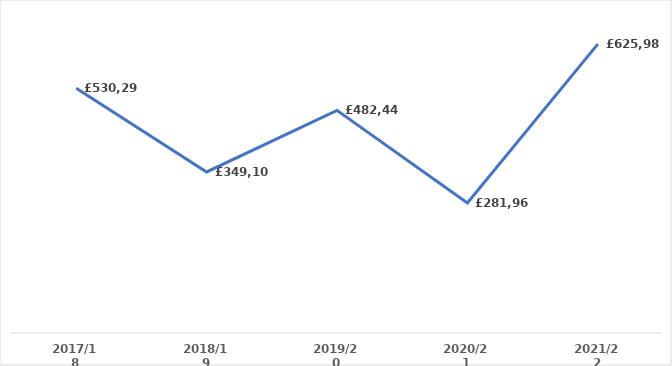
| Category | Council Tax arrears |
|---|---|
| 2017/18 | 530297.43 |
| 2018/19 | 349101.41 |
| 2019/20 | 482442.09 |
| 2020/21 | 281967.21 |
| 2021/22 | 625987.854 |